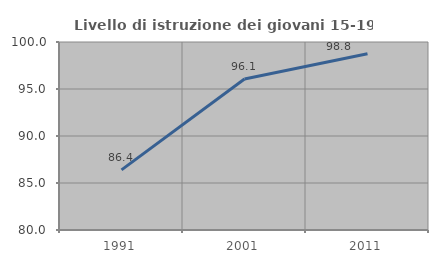
| Category | Livello di istruzione dei giovani 15-19 anni |
|---|---|
| 1991.0 | 86.4 |
| 2001.0 | 96.071 |
| 2011.0 | 98.759 |